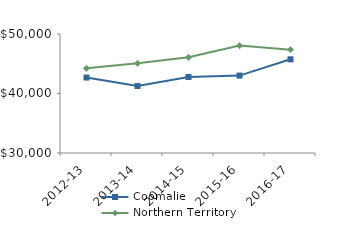
| Category | Coomalie | Northern Territory |
|---|---|---|
| 2012-13 | 42681.07 | 44232.02 |
| 2013-14 | 41254.59 | 45075.51 |
| 2014-15 | 42779 | 46083.65 |
| 2015-16 | 43007.5 | 48046.27 |
| 2016-17 | 45746.67 | 47367.05 |